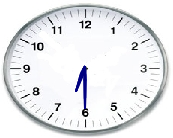
| Category | Series 0 |
|---|---|
| 0.0 | 0 |
| -0.03046733585128701 | -0.248 |
| -0.23293714059226858 | -0.869 |
| -0.09768278212231846 | -0.23 |
| 0.0 | 0 |
| -0.04770224884413615 | -0.245 |
| -0.23293714059226858 | -0.869 |
| -0.08139203861428916 | -0.236 |
| 0.0 | 0 |
| 0.017449748351250197 | -0.5 |
| -2.6646978894262485e-16 | -1.45 |
| 0.008726203218641565 | -0.5 |
| 0.0 | 0 |
| -0.01744974835125038 | -0.5 |
| -2.6646978894262485e-16 | -1.45 |
| -0.008726203218641749 | -0.5 |
| 0.0 | 0 |